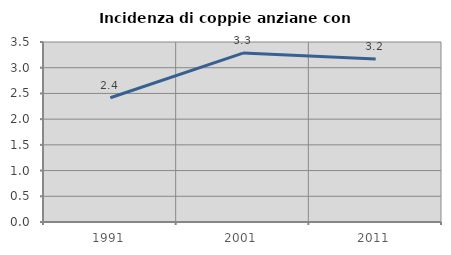
| Category | Incidenza di coppie anziane con figli |
|---|---|
| 1991.0 | 2.416 |
| 2001.0 | 3.284 |
| 2011.0 | 3.17 |